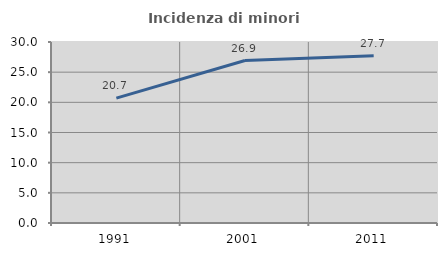
| Category | Incidenza di minori stranieri |
|---|---|
| 1991.0 | 20.69 |
| 2001.0 | 26.923 |
| 2011.0 | 27.706 |